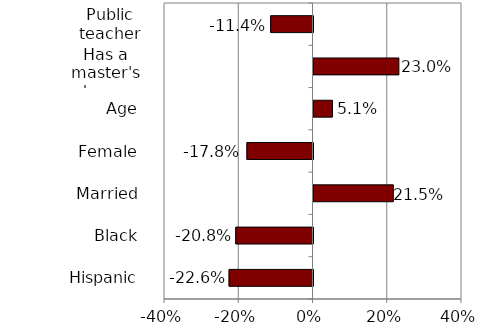
| Category | Series 0 |
|---|---|
| Hispanic | -0.226 |
| Black | -0.208 |
| Married | 0.215 |
| Female | -0.178 |
| Age | 0.051 |
| Has a master's degree | 0.23 |
| Public teacher | -0.114 |